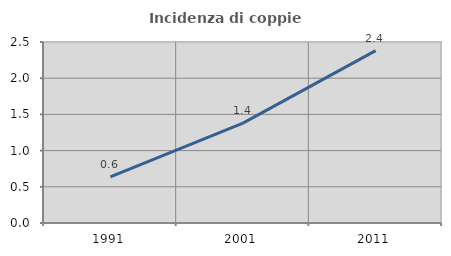
| Category | Incidenza di coppie miste |
|---|---|
| 1991.0 | 0.637 |
| 2001.0 | 1.379 |
| 2011.0 | 2.381 |